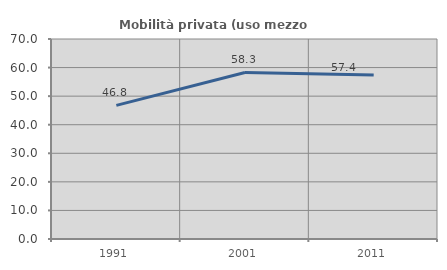
| Category | Mobilità privata (uso mezzo privato) |
|---|---|
| 1991.0 | 46.78 |
| 2001.0 | 58.287 |
| 2011.0 | 57.42 |